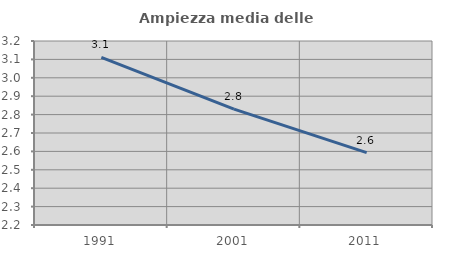
| Category | Ampiezza media delle famiglie |
|---|---|
| 1991.0 | 3.111 |
| 2001.0 | 2.829 |
| 2011.0 | 2.593 |